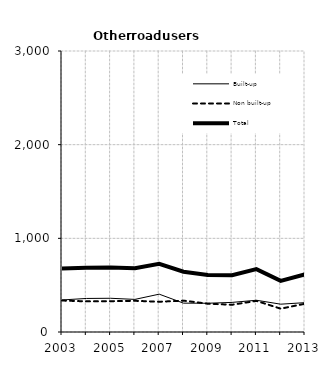
| Category | Built-up | Non built-up | Total |
|---|---|---|---|
| 2003.0 | 342 | 336 | 678 |
| 2004.0 | 358 | 327 | 685 |
| 2005.0 | 360 | 329 | 689 |
| 2006.0 | 348 | 333 | 681 |
| 2007.0 | 404 | 323 | 727 |
| 2008.0 | 308 | 335 | 643 |
| 2009.0 | 307 | 302 | 609 |
| 2010.0 | 316 | 291 | 607 |
| 2011.0 | 339 | 332 | 671 |
| 2012.0 | 297 | 249 | 546 |
| 2013.0 | 313.4 | 301.8 | 615.2 |